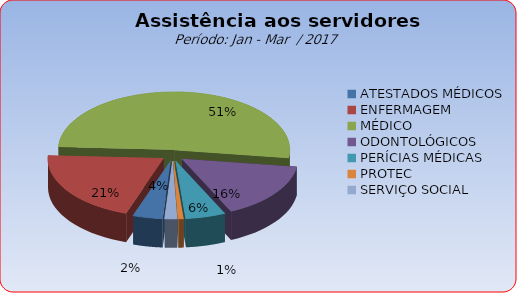
| Category | Series 0 |
|---|---|
| ATESTADOS MÉDICOS | 4.148 |
| ENFERMAGEM | 20.513 |
| MÉDICO | 51.433 |
| ODONTOLÓGICOS | 15.837 |
| PERÍCIAS MÉDICAS | 5.581 |
| PROTEC | 0.754 |
| SERVIÇO SOCIAL | 1.735 |